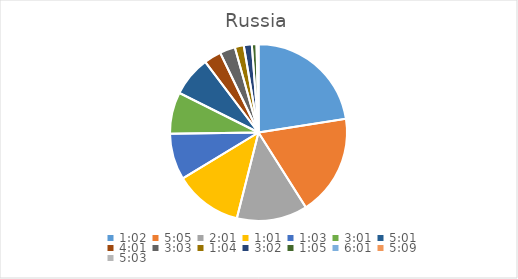
| Category | Series 0 |
|---|---|
| 0.04305555555555556 | 25.983 |
| 0.21180555555555555 | 21.345 |
| 0.08402777777777777 | 14.895 |
| 0.042361111111111106 | 14.279 |
| 0.043750000000000004 | 9.773 |
| 0.12569444444444444 | 8.759 |
| 0.20902777777777778 | 8.475 |
| 0.1673611111111111 | 3.635 |
| 0.12708333333333333 | 3.246 |
| 0.044444444444444446 | 1.89 |
| 0.12638888888888888 | 1.693 |
| 0.04513888888888889 | 0.99 |
| 0.25069444444444444 | 0.271 |
| 0.21458333333333335 | 0.097 |
| 0.21041666666666667 | 0.038 |